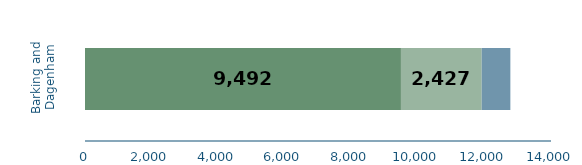
| Category | Series 0 | Series 1 | Series 2 |
|---|---|---|---|
| Barking and Dagenham | 9492 | 2427 | 860 |